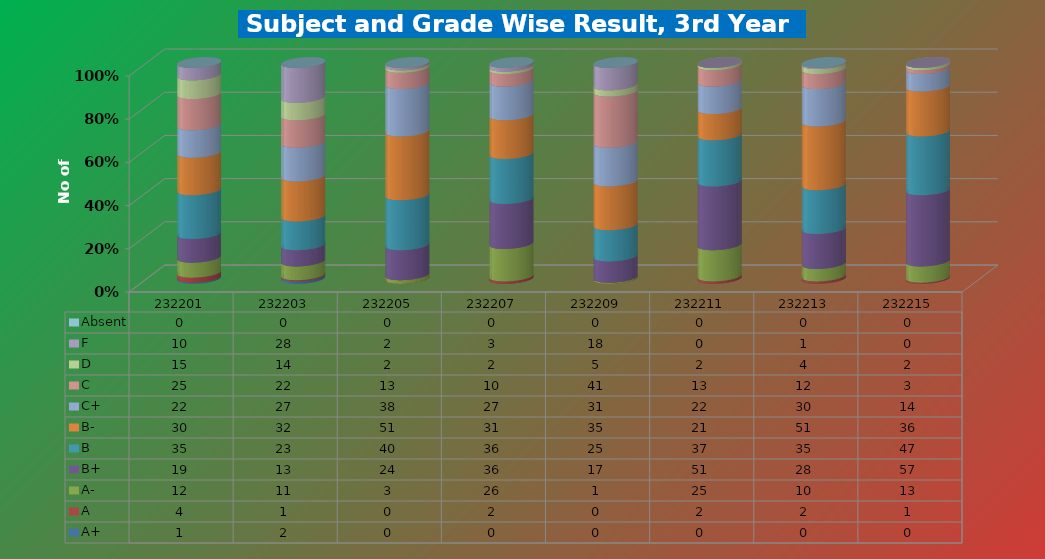
| Category | A+ | A | A- | B+ | B | B- | C+ | C | D | F | Absent |
|---|---|---|---|---|---|---|---|---|---|---|---|
| 232201.0 | 1 | 4 | 12 | 19 | 35 | 30 | 22 | 25 | 15 | 10 | 0 |
| 232203.0 | 2 | 1 | 11 | 13 | 23 | 32 | 27 | 22 | 14 | 28 | 0 |
| 232205.0 | 0 | 0 | 3 | 24 | 40 | 51 | 38 | 13 | 2 | 2 | 0 |
| 232207.0 | 0 | 2 | 26 | 36 | 36 | 31 | 27 | 10 | 2 | 3 | 0 |
| 232209.0 | 0 | 0 | 1 | 17 | 25 | 35 | 31 | 41 | 5 | 18 | 0 |
| 232211.0 | 0 | 2 | 25 | 51 | 37 | 21 | 22 | 13 | 2 | 0 | 0 |
| 232213.0 | 0 | 2 | 10 | 28 | 35 | 51 | 30 | 12 | 4 | 1 | 0 |
| 232215.0 | 0 | 1 | 13 | 57 | 47 | 36 | 14 | 3 | 2 | 0 | 0 |